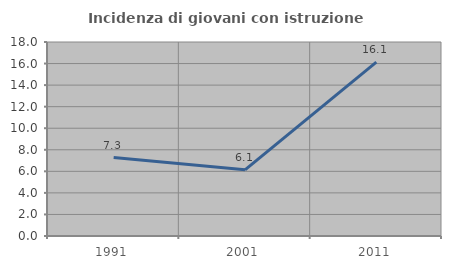
| Category | Incidenza di giovani con istruzione universitaria |
|---|---|
| 1991.0 | 7.273 |
| 2001.0 | 6.14 |
| 2011.0 | 16.129 |